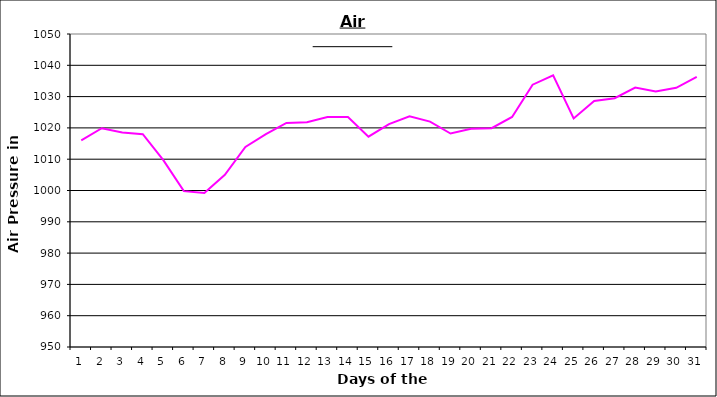
| Category | Series 0 |
|---|---|
| 0 | 1016 |
| 1 | 1019.9 |
| 2 | 1018.5 |
| 3 | 1018 |
| 4 | 1009.7 |
| 5 | 999.8 |
| 6 | 999.2 |
| 7 | 1005 |
| 8 | 1013.9 |
| 9 | 1018 |
| 10 | 1021.6 |
| 11 | 1021.8 |
| 12 | 1023.5 |
| 13 | 1023.5 |
| 14 | 1017.2 |
| 15 | 1021.2 |
| 16 | 1023.7 |
| 17 | 1022 |
| 18 | 1018.2 |
| 19 | 1019.7 |
| 20 | 1019.9 |
| 21 | 1023.5 |
| 22 | 1033.8 |
| 23 | 1036.8 |
| 24 | 1023 |
| 25 | 1028.6 |
| 26 | 1029.5 |
| 27 | 1032.9 |
| 28 | 1031.6 |
| 29 | 1032.8 |
| 30 | 1036.3 |